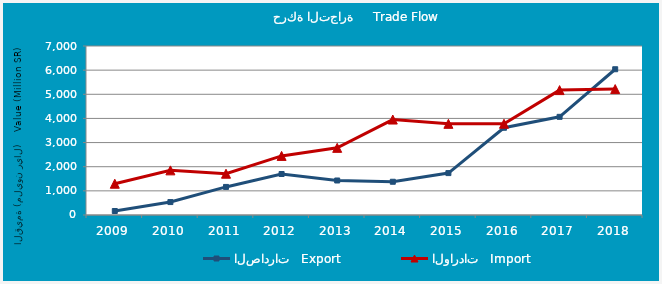
| Category | الصادرات   Export | الواردات   Import |
|---|---|---|
| 2009.0 | 165633707 | 1295323623 |
| 2010.0 | 535817139 | 1848853493 |
| 2011.0 | 1162964492 | 1709997311 |
| 2012.0 | 1697923030 | 2447700022 |
| 2013.0 | 1429091980 | 2781384810 |
| 2014.0 | 1376814487 | 3953843861 |
| 2015.0 | 1735576385 | 3776132172 |
| 2016.0 | 3613425176 | 3778638327 |
| 2017.0 | 4065916779 | 5173102226 |
| 2018.0 | 6037562040 | 5215779340 |